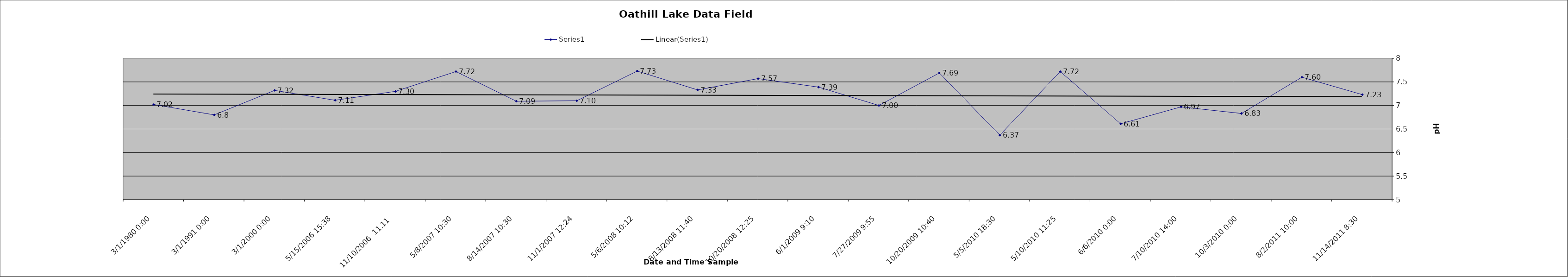
| Category | Series 0 |
|---|---|
| 01/03/1980 0:00 | 7.02 |
| 01/03/1991 0:00 | 6.8 |
| 01/03/2000 0:00 | 7.32 |
| 15/05/2006 15:38 | 7.11 |
| 11/10/2006  11.11  | 7.3 |
| 08/05/2007 10:30 | 7.72 |
| 14/08/2007 10:30 | 7.09 |
| 01/11/2007 12:24 | 7.1 |
| 06/05/2008 10:12 | 7.73 |
| 13/08/2008 11:40 | 7.33 |
| 20/10/2008 12:25 | 7.57 |
| 01/06/2009 9:10 | 7.39 |
| 27/07/2009 9:55 | 7 |
| 20/10/2009 10:40 | 7.69 |
| 05/05/2010 18:30 | 6.37 |
| 10/05/2010 11:25 | 7.72 |
| 06/06/2010 0:00 | 6.61 |
| 10/07/2010 14:00 | 6.97 |
| 03/10/2010 0:00 | 6.83 |
| 02/08/2011 10:00 | 7.6 |
| 14/11/2011 8:30 | 7.23 |